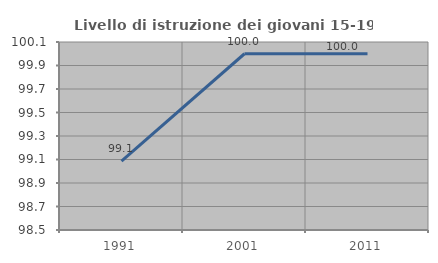
| Category | Livello di istruzione dei giovani 15-19 anni |
|---|---|
| 1991.0 | 99.087 |
| 2001.0 | 100 |
| 2011.0 | 100 |